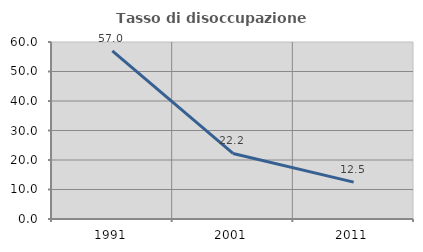
| Category | Tasso di disoccupazione giovanile  |
|---|---|
| 1991.0 | 57.025 |
| 2001.0 | 22.222 |
| 2011.0 | 12.5 |